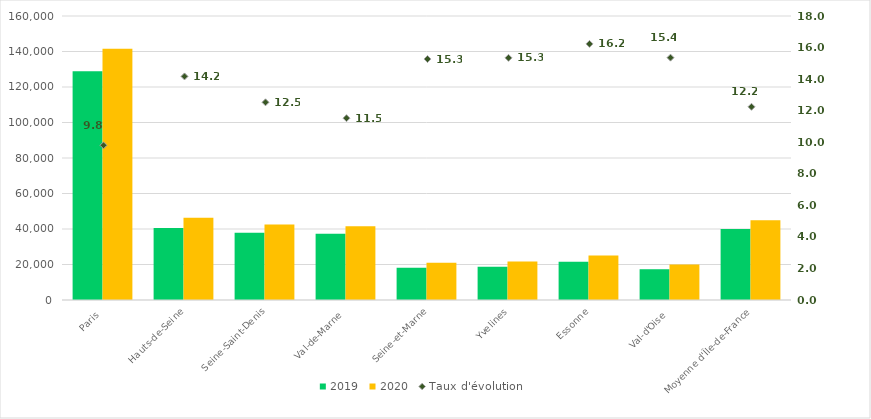
| Category | 2019 | 2020 |
|---|---|---|
| Paris | 128932 | 141574 |
| Hauts-de-Seine | 40575 | 46324 |
| Seine-Saint-Denis | 37832 | 42573 |
| Val-de-Marne | 37261 | 41555 |
| Seine-et-Marne | 18156 | 20929 |
| Yvelines | 18765 | 21645 |
| Essonne | 21589 | 25093 |
| Val-d'Oise | 17333 | 19995 |
| Moyenne d'Île-de-France | 40055.375 | 44961 |